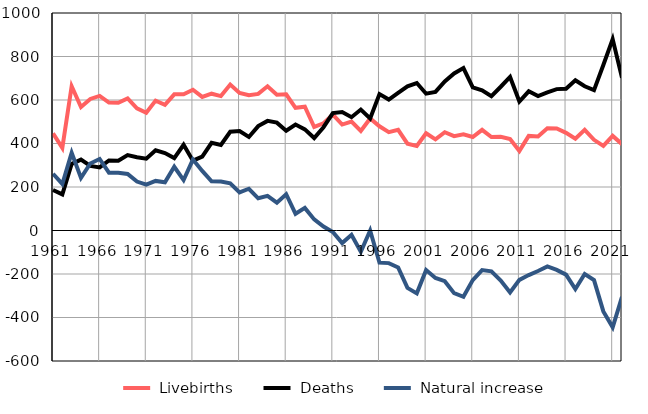
| Category |  Livebirths |  Deaths |  Natural increase |
|---|---|---|---|
| 1961.0 | 447 | 186 | 261 |
| 1962.0 | 380 | 166 | 214 |
| 1963.0 | 663 | 306 | 357 |
| 1964.0 | 568 | 326 | 242 |
| 1965.0 | 605 | 297 | 308 |
| 1966.0 | 619 | 290 | 329 |
| 1967.0 | 588 | 322 | 266 |
| 1968.0 | 587 | 321 | 266 |
| 1969.0 | 607 | 347 | 260 |
| 1970.0 | 562 | 337 | 225 |
| 1971.0 | 541 | 330 | 211 |
| 1972.0 | 597 | 369 | 228 |
| 1973.0 | 578 | 356 | 222 |
| 1974.0 | 626 | 333 | 293 |
| 1975.0 | 626 | 394 | 232 |
| 1976.0 | 647 | 321 | 326 |
| 1977.0 | 614 | 340 | 274 |
| 1978.0 | 629 | 403 | 226 |
| 1979.0 | 618 | 393 | 225 |
| 1980.0 | 671 | 454 | 217 |
| 1981.0 | 632 | 457 | 175 |
| 1982.0 | 622 | 430 | 192 |
| 1983.0 | 628 | 480 | 148 |
| 1984.0 | 663 | 504 | 159 |
| 1985.0 | 624 | 496 | 128 |
| 1986.0 | 626 | 459 | 167 |
| 1987.0 | 564 | 487 | 77 |
| 1988.0 | 569 | 465 | 104 |
| 1989.0 | 476 | 425 | 51 |
| 1990.0 | 493 | 475 | 18 |
| 1991.0 | 533 | 540 | -7 |
| 1992.0 | 487 | 545 | -58 |
| 1993.0 | 501 | 521 | -20 |
| 1994.0 | 458 | 556 | -98 |
| 1995.0 | 515 | 515 | 0 |
| 1996.0 | 479 | 627 | -148 |
| 1997.0 | 452 | 602 | -150 |
| 1998.0 | 463 | 633 | -170 |
| 1999.0 | 399 | 663 | -264 |
| 2000.0 | 389 | 678 | -289 |
| 2001.0 | 447 | 629 | -182 |
| 2002.0 | 419 | 637 | -218 |
| 2003.0 | 452 | 685 | -233 |
| 2004.0 | 434 | 722 | -288 |
| 2005.0 | 442 | 747 | -305 |
| 2006.0 | 430 | 658 | -228 |
| 2007.0 | 463 | 645 | -182 |
| 2008.0 | 430 | 618 | -188 |
| 2009.0 | 431 | 661 | -230 |
| 2010.0 | 421 | 706 | -285 |
| 2011.0 | 366 | 593 | -227 |
| 2012.0 | 435 | 640 | -205 |
| 2013.0 | 432 | 618 | -186 |
| 2014.0 | 470 | 635 | -165 |
| 2015.0 | 469 | 650 | -181 |
| 2016.0 | 449 | 652 | -203 |
| 2017.0 | 422 | 691 | -269 |
| 2018.0 | 463 | 663 | -200 |
| 2019.0 | 417 | 645 | -228 |
| 2020.0 | 389 | 761 | -372 |
| 2021.0 | 435 | 880 | -445 |
| 2022.0 | 397 | 702 | -305 |